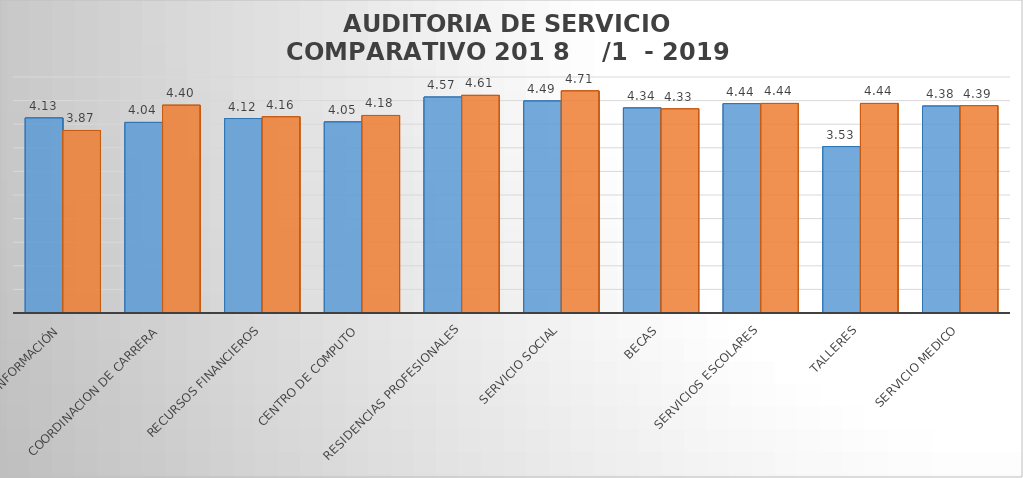
| Category | 1ER. AUDIT | 2DA. AUDIT |
|---|---|---|
| CENTRO DE INFORMACIÓN | 4.132 | 3.867 |
| COORDINACION DE CARRERA | 4.037 | 4.402 |
| RECURSOS FINANCIEROS | 4.12 | 4.157 |
| CENTRO DE COMPUTO | 4.048 | 4.185 |
| RESIDENCIAS PROFESIONALES | 4.575 | 4.611 |
| SERVICIO SOCIAL | 4.492 | 4.706 |
| BECAS | 4.344 | 4.326 |
| SERVICIOS ESCOLARES | 4.436 | 4.44 |
| TALLERES | 3.527 | 4.44 |
| SERVICIO MEDICO | 4.384 | 4.393 |